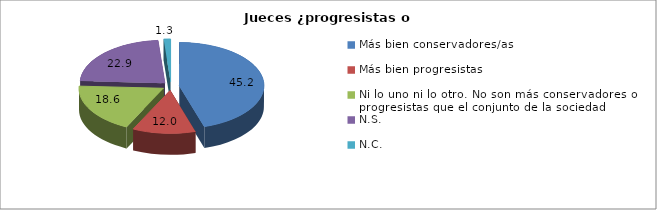
| Category | % |
|---|---|
| Más bien conservadores/as | 45.2 |
| Más bien progresistas | 12 |
| Ni lo uno ni lo otro. No son más conservadores o progresistas que el conjunto de la sociedad  | 18.6 |
| N.S.  | 22.9 |
| N.C.  | 1.3 |